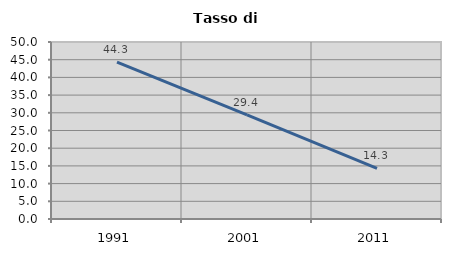
| Category | Tasso di disoccupazione   |
|---|---|
| 1991.0 | 44.286 |
| 2001.0 | 29.431 |
| 2011.0 | 14.286 |